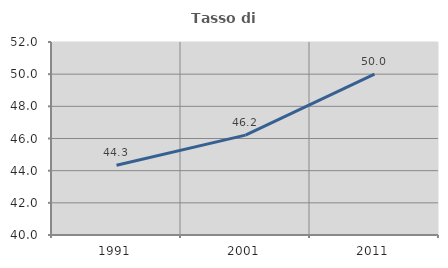
| Category | Tasso di occupazione   |
|---|---|
| 1991.0 | 44.334 |
| 2001.0 | 46.209 |
| 2011.0 | 50 |